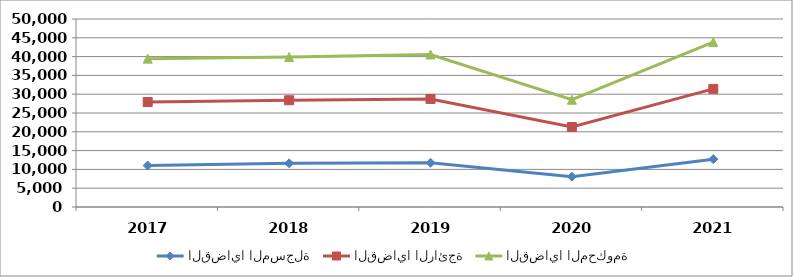
| Category | القضايا المسجلة | القضايا الرائجة | القضايا المحكومة |
|---|---|---|---|
| 2017.0 | 11027 | 16888 | 11545 |
| 2018.0 | 11626 | 16764 | 11522 |
| 2019.0 | 11757 | 16977 | 11822 |
| 2020.0 | 8064 | 13219 | 7255 |
| 2021.0 | 12725 | 18689 | 12447 |